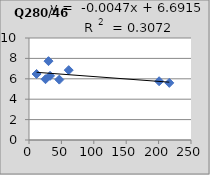
| Category | Q280/465 |
|---|---|
| 25.5 | 5.96 |
| 61.3 | 6.85 |
| 11.7 | 6.47 |
| 216.5 | 5.6 |
| 46.8 | 5.92 |
| 32.5 | 6.29 |
| 200.8 | 5.76 |
| 30.1 | 7.73 |